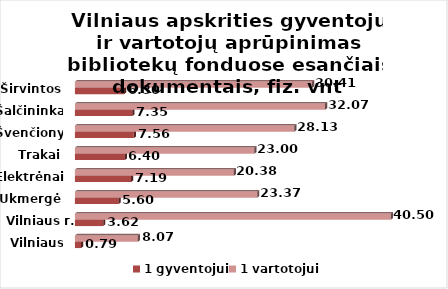
| Category | 1 gyventojui | 1 vartotojui |
|---|---|---|
| Vilniaus m. | 0.79 | 8.07 |
| Vilniaus r. | 3.62 | 40.5 |
| Ukmergė | 5.6 | 23.37 |
| Elektrėnai | 7.19 | 20.38 |
| Trakai | 6.4 | 23 |
| Švenčionys | 7.56 | 28.13 |
| Šalčininkai | 7.35 | 32.07 |
| Širvintos | 6.3 | 30.41 |